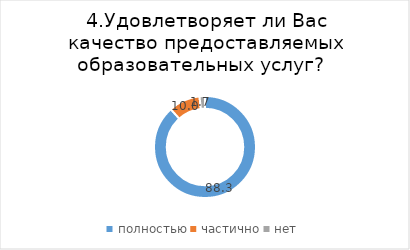
| Category | Series 0 |
|---|---|
| полностью | 88.286 |
| частично | 9.988 |
| нет | 1.726 |